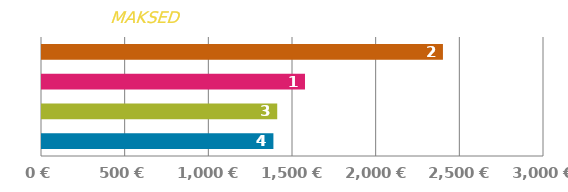
| Category | MAKSE |
|---|---|
| 0 | 1382.921 |
| 1 | 1405.775 |
| 2 | 1571.655 |
| 3 | 2396.046 |